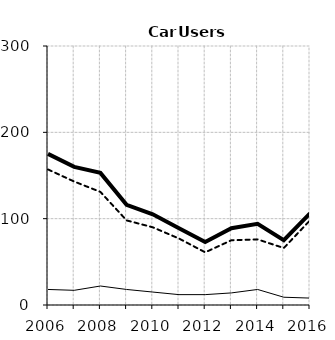
| Category | Built-up | Non built-up | Total |
|---|---|---|---|
| 2006.0 | 18 | 157 | 175 |
| 2007.0 | 17 | 143 | 160 |
| 2008.0 | 22 | 131 | 153 |
| 2009.0 | 18 | 98 | 116 |
| 2010.0 | 15 | 90 | 105 |
| 2011.0 | 12 | 77 | 89 |
| 2012.0 | 12 | 61 | 73 |
| 2013.0 | 14 | 75 | 89 |
| 2014.0 | 18 | 76 | 94 |
| 2015.0 | 9 | 66 | 75 |
| 2016.0 | 8 | 98 | 106 |